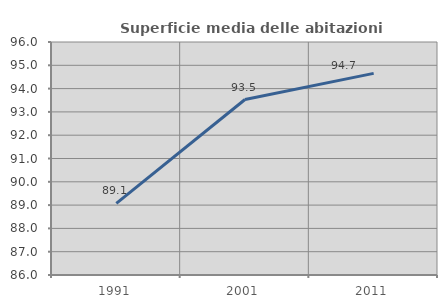
| Category | Superficie media delle abitazioni occupate |
|---|---|
| 1991.0 | 89.071 |
| 2001.0 | 93.531 |
| 2011.0 | 94.654 |